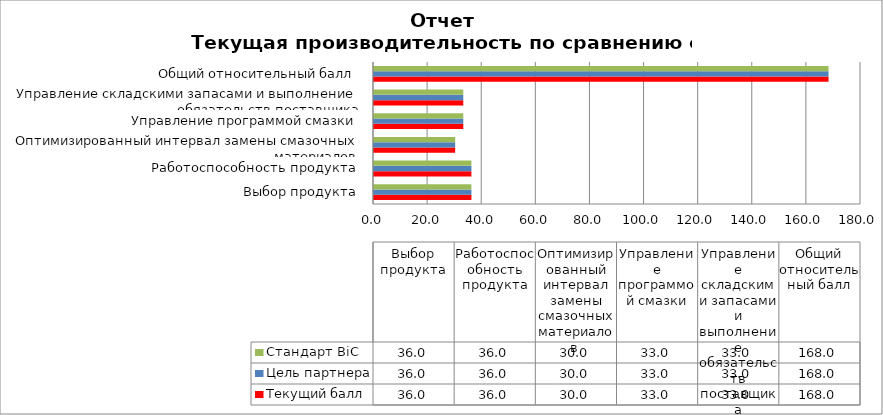
| Category | Текущий балл | Цель партнера | Стандарт BiC |
|---|---|---|---|
| Выбор продукта | 36 | 36 | 36 |
| Работоспособность продукта | 36 | 36 | 36 |
| Оптимизированный интервал замены смазочных материалов  | 30 | 30 | 30 |
| Управление программой смазки | 33 | 33 | 33 |
| Управление складскими запасами и выполнение обязательств поставщика | 33 | 33 | 33 |
| Общий относительный балл | 168 | 168 | 168 |